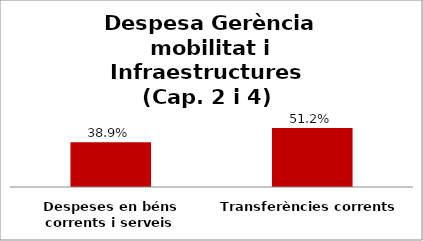
| Category | Series 0 |
|---|---|
| Despeses en béns corrents i serveis | 0.389 |
| Transferències corrents | 0.512 |